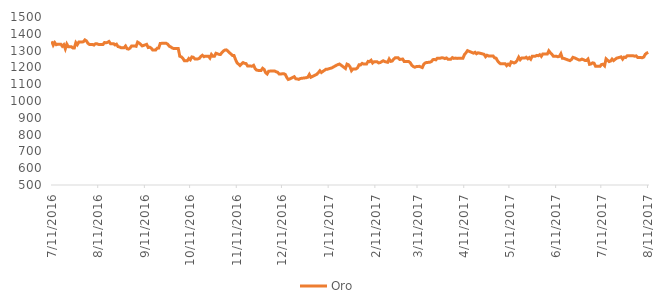
| Category | Oro |
|---|---|
| 7/11/16 | 1355.25 |
| 7/12/16 | 1332.5 |
| 7/13/16 | 1347.5 |
| 7/14/16 | 1335.1 |
| 7/15/16 | 1337.85 |
| 7/17/16 | 1337.85 |
| 7/18/16 | 1326 |
| 7/19/16 | 1334.8 |
| 7/20/16 | 1310.5 |
| 7/21/16 | 1339 |
| 7/22/16 | 1323.18 |
| 7/24/16 | 1323.18 |
| 7/25/16 | 1315.7 |
| 7/26/16 | 1316 |
| 7/27/16 | 1347.5 |
| 7/28/16 | 1335.5 |
| 7/29/16 | 1351.1 |
| 7/31/16 | 1351.1 |
| 8/1/16 | 1352.78 |
| 8/2/16 | 1363.68 |
| 8/3/16 | 1357.9 |
| 8/4/16 | 1343.5 |
| 8/5/16 | 1336.6 |
| 8/7/16 | 1336.6 |
| 8/8/16 | 1333 |
| 8/9/16 | 1340.7 |
| 8/10/16 | 1340.5 |
| 8/11/16 | 1337 |
| 8/12/16 | 1336.2 |
| 8/14/16 | 1336.2 |
| 8/15/16 | 1348.1 |
| 8/16/16 | 1346.55 |
| 8/17/16 | 1348.75 |
| 8/18/16 | 1354.2 |
| 8/19/16 | 1341.5 |
| 8/21/16 | 1341.5 |
| 8/22/16 | 1333.75 |
| 8/23/16 | 1338.1 |
| 8/24/16 | 1323.75 |
| 8/25/16 | 1321.7 |
| 8/26/16 | 1317.25 |
| 8/28/16 | 1317.25 |
| 8/29/16 | 1327.2 |
| 8/30/16 | 1311.15 |
| 8/31/16 | 1308.95 |
| 9/1/16 | 1315.25 |
| 9/2/16 | 1327.75 |
| 9/4/16 | 1327.75 |
| 9/5/16 | 1325.55 |
| 9/6/16 | 1350.3 |
| 9/7/16 | 1344.95 |
| 9/8/16 | 1337.75 |
| 9/9/16 | 1328.05 |
| 9/12/16 | 1337.1 |
| 9/13/16 | 1318.5 |
| 9/14/16 | 1320.3 |
| 9/15/16 | 1314.8 |
| 9/16/16 | 1303.55 |
| 9/18/16 | 1303.55 |
| 9/19/16 | 1314.2 |
| 9/20/16 | 1315.1 |
| 9/21/16 | 1342.2 |
| 9/22/16 | 1343.2 |
| 9/23/16 | 1343.2 |
| 9/25/16 | 1343.2 |
| 9/26/16 | 1337.95 |
| 9/27/16 | 1326.4 |
| 9/28/16 | 1321.95 |
| 9/29/16 | 1315.8 |
| 9/30/16 | 1312 |
| 10/2/16 | 1312 |
| 10/3/16 | 1311.88 |
| 10/4/16 | 1266.25 |
| 10/5/16 | 1263 |
| 10/6/16 | 1254.7 |
| 10/7/16 | 1240.25 |
| 10/9/16 | 1240.25 |
| 10/10/16 | 1253.1 |
| 10/11/16 | 1245.25 |
| 10/12/16 | 1262.35 |
| 10/13/16 | 1260.25 |
| 10/14/16 | 1250.55 |
| 10/16/16 | 1250.55 |
| 10/17/16 | 1254 |
| 10/18/16 | 1265.25 |
| 10/19/16 | 1272.25 |
| 10/20/16 | 1263.63 |
| 10/21/16 | 1266.75 |
| 10/23/16 | 1266.75 |
| 10/24/16 | 1255.55 |
| 10/25/16 | 1276.75 |
| 10/26/16 | 1265.75 |
| 10/27/16 | 1265.75 |
| 10/28/16 | 1284.25 |
| 10/30/16 | 1277.7 |
| 10/31/16 | 1276.7 |
| 11/1/16 | 1289.05 |
| 11/2/16 | 1298.1 |
| 11/3/16 | 1303.05 |
| 11/4/16 | 1304.25 |
| 11/7/16 | 1279.25 |
| 11/8/16 | 1271.25 |
| 11/9/16 | 1270.55 |
| 11/10/16 | 1246.95 |
| 11/11/16 | 1227.6 |
| 11/13/16 | 1211.25 |
| 11/14/16 | 1221.1 |
| 11/15/16 | 1228.7 |
| 11/16/16 | 1224.15 |
| 11/17/16 | 1222.78 |
| 11/18/16 | 1208.55 |
| 11/21/16 | 1207.25 |
| 11/22/16 | 1212.3 |
| 11/23/16 | 1193.38 |
| 11/24/16 | 1184.08 |
| 11/25/16 | 1182.25 |
| 11/27/16 | 1182.25 |
| 11/28/16 | 1194.75 |
| 11/29/16 | 1187.75 |
| 11/30/16 | 1168.55 |
| 12/1/16 | 1161 |
| 12/2/16 | 1177.5 |
| 12/5/16 | 1178.85 |
| 12/6/16 | 1178.75 |
| 12/7/16 | 1173.95 |
| 12/8/16 | 1170.75 |
| 12/9/16 | 1160.35 |
| 12/12/16 | 1162.45 |
| 12/13/16 | 1158.25 |
| 12/14/16 | 1140.25 |
| 12/15/16 | 1128.2 |
| 12/16/16 | 1131.25 |
| 12/19/16 | 1144.75 |
| 12/20/16 | 1132.05 |
| 12/21/16 | 1131.25 |
| 12/22/16 | 1128.78 |
| 12/23/16 | 1133.95 |
| 12/27/16 | 1138.85 |
| 12/28/16 | 1141.58 |
| 12/29/16 | 1157.9 |
| 12/30/16 | 1141.25 |
| 1/3/17 | 1158.98 |
| 1/4/17 | 1168.88 |
| 1/5/17 | 1179.88 |
| 1/6/17 | 1169.75 |
| 1/9/17 | 1188.75 |
| 1/10/17 | 1189.25 |
| 1/13/17 | 1197.45 |
| 1/16/17 | 1212.75 |
| 1/17/17 | 1216.85 |
| 1/18/17 | 1220.08 |
| 1/19/17 | 1213.75 |
| 1/22/17 | 1193.35 |
| 1/23/17 | 1219.45 |
| 1/24/17 | 1215.35 |
| 1/25/17 | 1203.75 |
| 1/26/17 | 1180.63 |
| 1/27/17 | 1191.18 |
| 1/29/17 | 1191.18 |
| 1/30/17 | 1197.75 |
| 1/31/17 | 1215.35 |
| 2/1/17 | 1214.75 |
| 2/2/17 | 1224.05 |
| 2/3/17 | 1220.2 |
| 2/5/17 | 1220.2 |
| 2/6/17 | 1235.83 |
| 2/7/17 | 1233.75 |
| 2/8/17 | 1242.38 |
| 2/9/17 | 1226.33 |
| 2/10/17 | 1233.58 |
| 2/12/17 | 1233.58 |
| 2/13/17 | 1226.95 |
| 2/14/17 | 1228.68 |
| 2/16/17 | 1239.35 |
| 2/17/17 | 1235.03 |
| 2/19/17 | 1230.25 |
| 2/20/17 | 1249.75 |
| 2/21/17 | 1235.95 |
| 2/22/17 | 1237.6 |
| 2/23/17 | 1249.3 |
| 2/24/17 | 1256.98 |
| 2/26/17 | 1256.98 |
| 2/27/17 | 1247.25 |
| 2/28/17 | 1248.38 |
| 3/1/17 | 1249.75 |
| 3/2/17 | 1234.65 |
| 3/3/17 | 1234.78 |
| 3/5/17 | 1234.78 |
| 3/6/17 | 1228.05 |
| 3/7/17 | 1212.95 |
| 3/8/17 | 1205.25 |
| 3/9/17 | 1200.9 |
| 3/10/17 | 1204.8 |
| 3/12/17 | 1206.35 |
| 3/13/17 | 1202.63 |
| 3/14/17 | 1199.03 |
| 3/15/17 | 1218.88 |
| 3/16/17 | 1227.08 |
| 3/17/17 | 1229.15 |
| 3/19/17 | 1230.83 |
| 3/20/17 | 1234.38 |
| 3/21/17 | 1245.88 |
| 3/22/17 | 1247.48 |
| 3/23/17 | 1244.88 |
| 3/24/17 | 1254.98 |
| 3/26/17 | 1254.98 |
| 3/27/17 | 1257.45 |
| 3/28/17 | 1256.15 |
| 3/29/17 | 1252.45 |
| 3/30/17 | 1256.25 |
| 3/31/17 | 1249.13 |
| 4/2/17 | 1249.13 |
| 4/3/17 | 1258.25 |
| 4/4/17 | 1253.75 |
| 4/5/17 | 1255.3 |
| 4/6/17 | 1253.55 |
| 4/7/17 | 1254.05 |
| 4/8/17 | 1254.05 |
| 4/9/17 | 1254.05 |
| 4/10/17 | 1254.73 |
| 4/11/17 | 1276.75 |
| 4/12/17 | 1286.6 |
| 4/13/17 | 1299.75 |
| 4/17/17 | 1284.8 |
| 4/18/17 | 1289.65 |
| 4/19/17 | 1281.4 |
| 4/20/17 | 1286.75 |
| 4/21/17 | 1285 |
| 4/24/17 | 1278 |
| 4/25/17 | 1263.75 |
| 4/26/17 | 1272.25 |
| 4/27/17 | 1268.25 |
| 4/28/17 | 1268.15 |
| 4/30/17 | 1268.15 |
| 5/1/17 | 1256.8 |
| 5/2/17 | 1254.6 |
| 5/3/17 | 1238.38 |
| 5/4/17 | 1227.75 |
| 5/5/17 | 1221.2 |
| 5/8/17 | 1222.3 |
| 5/9/17 | 1210.7 |
| 5/10/17 | 1219.15 |
| 5/11/17 | 1213.05 |
| 5/12/17 | 1233.25 |
| 5/14/17 | 1226.25 |
| 5/15/17 | 1230.73 |
| 5/16/17 | 1241.75 |
| 5/17/17 | 1260.73 |
| 5/18/17 | 1245.95 |
| 5/19/17 | 1255.55 |
| 5/21/17 | 1255.55 |
| 5/22/17 | 1260.45 |
| 5/23/17 | 1251.15 |
| 5/24/17 | 1258.2 |
| 5/25/17 | 1249 |
| 5/26/17 | 1267.05 |
| 5/28/17 | 1267.05 |
| 5/29/17 | 1271.45 |
| 5/30/17 | 1269.5 |
| 5/31/17 | 1275.5 |
| 6/1/17 | 1265.65 |
| 6/2/17 | 1279.98 |
| 6/5/17 | 1279.95 |
| 6/6/17 | 1298.75 |
| 6/7/17 | 1286.93 |
| 6/8/17 | 1278.65 |
| 6/9/17 | 1266.4 |
| 6/11/17 | 1266.4 |
| 6/12/17 | 1263.25 |
| 6/13/17 | 1265.85 |
| 6/14/17 | 1281.45 |
| 6/15/17 | 1254 |
| 6/16/17 | 1253.63 |
| 6/19/17 | 1243.25 |
| 6/20/17 | 1240.25 |
| 6/21/17 | 1246.55 |
| 6/22/17 | 1259.93 |
| 6/23/17 | 1256.9 |
| 6/26/17 | 1244.45 |
| 6/27/17 | 1244.75 |
| 6/28/17 | 1249.33 |
| 6/29/17 | 1245.73 |
| 6/30/17 | 1241.6 |
| 7/1/17 | 1241.6 |
| 7/2/17 | 1249.8 |
| 7/3/17 | 1218.15 |
| 7/4/17 | 1220.4 |
| 7/5/17 | 1226.95 |
| 7/6/17 | 1225.15 |
| 7/7/17 | 1207.25 |
| 7/9/17 | 1207.25 |
| 7/10/17 | 1206.35 |
| 7/11/17 | 1217.7 |
| 7/12/17 | 1218.75 |
| 7/13/17 | 1209.45 |
| 7/14/17 | 1250.88 |
| 7/16/17 | 1234.75 |
| 7/17/17 | 1237.75 |
| 7/18/17 | 1249.75 |
| 7/19/17 | 1240.88 |
| 7/20/17 | 1247.75 |
| 7/21/17 | 1254.9 |
| 7/24/17 | 1262.75 |
| 7/25/17 | 1249.05 |
| 7/26/17 | 1261.1 |
| 7/27/17 | 1259 |
| 7/28/17 | 1269.25 |
| 7/31/17 | 1269.55 |
| 8/1/17 | 1269.05 |
| 8/2/17 | 1266.7 |
| 8/3/17 | 1268.65 |
| 8/4/17 | 1258.6 |
| 8/6/17 | 1258.6 |
| 8/7/17 | 1257.7 |
| 8/8/17 | 1261.5 |
| 8/9/17 | 1277.58 |
| 8/10/17 | 1285.2 |
| 8/11/17 | 1289.2 |